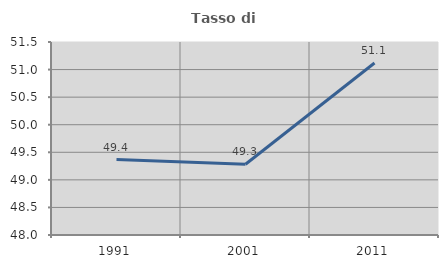
| Category | Tasso di occupazione   |
|---|---|
| 1991.0 | 49.369 |
| 2001.0 | 49.284 |
| 2011.0 | 51.119 |